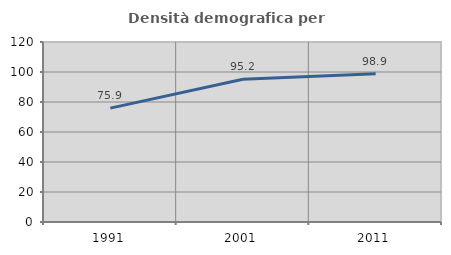
| Category | Densità demografica |
|---|---|
| 1991.0 | 75.901 |
| 2001.0 | 95.227 |
| 2011.0 | 98.862 |